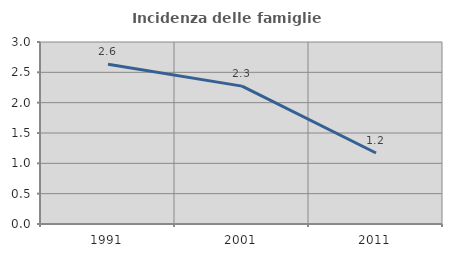
| Category | Incidenza delle famiglie numerose |
|---|---|
| 1991.0 | 2.634 |
| 2001.0 | 2.273 |
| 2011.0 | 1.171 |